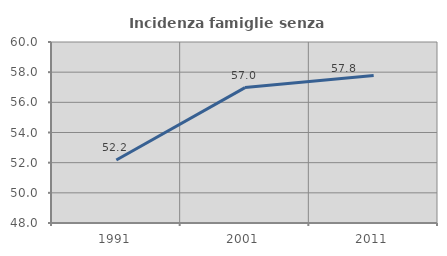
| Category | Incidenza famiglie senza nuclei |
|---|---|
| 1991.0 | 52.174 |
| 2001.0 | 56.977 |
| 2011.0 | 57.778 |